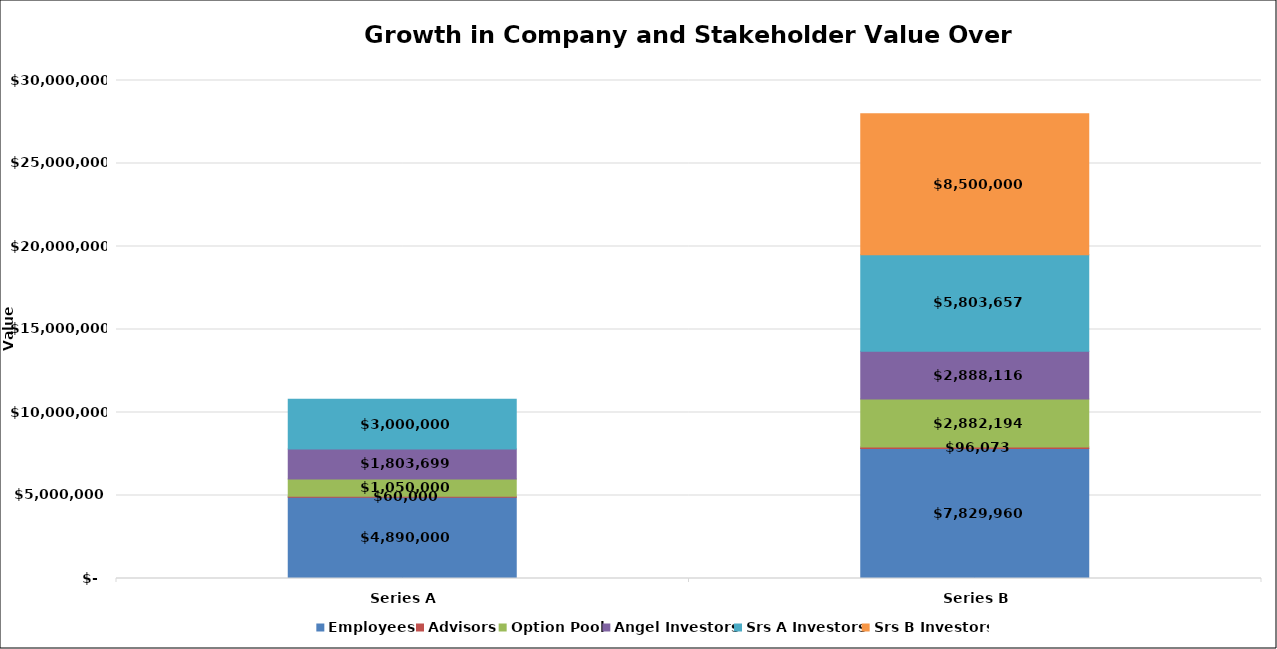
| Category | Employees | Advisors | Option Pool | Angel Investors | Srs A Investors | Srs B Investors |
|---|---|---|---|---|---|---|
| Series A  | 4890000 | 60000 | 1050000 | 1803698.63 | 3000000 | 0 |
| Series B | 7829960.162 | 96073.131 | 2882193.925 | 2888116.241 | 5803656.541 | 8500000 |